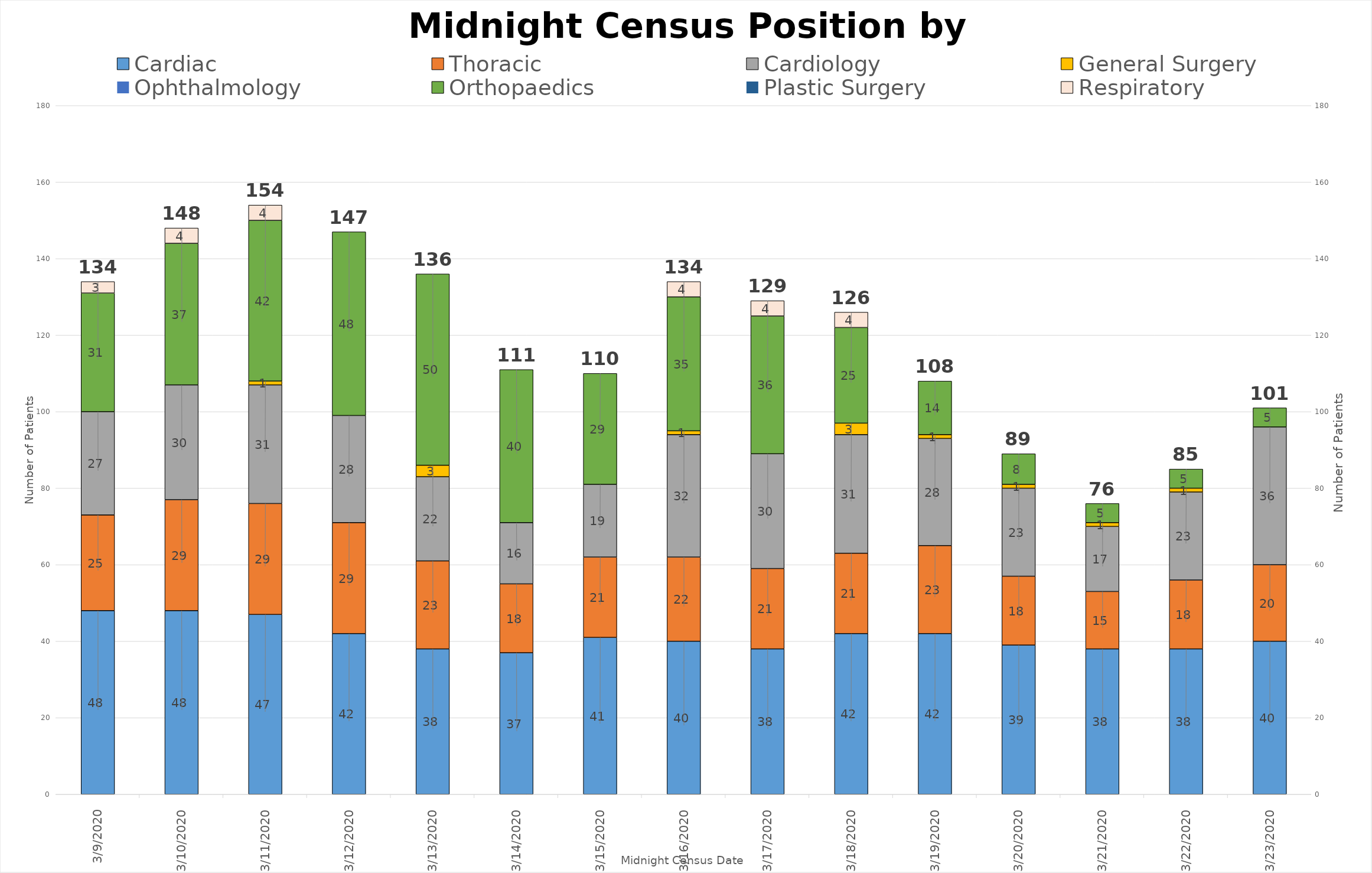
| Category | Cardiac | Thoracic | Cardiology | General Surgery | Ophthalmology | Orthopaedics | Plastic Surgery | Respiratory |
|---|---|---|---|---|---|---|---|---|
| 3/9/20 | 48 | 25 | 27 | 0 | 0 | 31 | 0 | 3 |
| 3/10/20 | 48 | 29 | 30 | 0 | 0 | 37 | 0 | 4 |
| 3/11/20 | 47 | 29 | 31 | 1 | 0 | 42 | 0 | 4 |
| 3/12/20 | 42 | 29 | 28 | 0 | 0 | 48 | 0 | 0 |
| 3/13/20 | 38 | 23 | 22 | 3 | 0 | 50 | 0 | 0 |
| 3/14/20 | 37 | 18 | 16 | 0 | 0 | 40 | 0 | 0 |
| 3/15/20 | 41 | 21 | 19 | 0 | 0 | 29 | 0 | 0 |
| 3/16/20 | 40 | 22 | 32 | 1 | 0 | 35 | 0 | 4 |
| 3/17/20 | 38 | 21 | 30 | 0 | 0 | 36 | 0 | 4 |
| 3/18/20 | 42 | 21 | 31 | 3 | 0 | 25 | 0 | 4 |
| 3/19/20 | 42 | 23 | 28 | 1 | 0 | 14 | 0 | 0 |
| 3/20/20 | 39 | 18 | 23 | 1 | 0 | 8 | 0 | 0 |
| 3/21/20 | 38 | 15 | 17 | 1 | 0 | 5 | 0 | 0 |
| 3/22/20 | 38 | 18 | 23 | 1 | 0 | 5 | 0 | 0 |
| 3/23/20 | 40 | 20 | 36 | 0 | 0 | 5 | 0 | 0 |